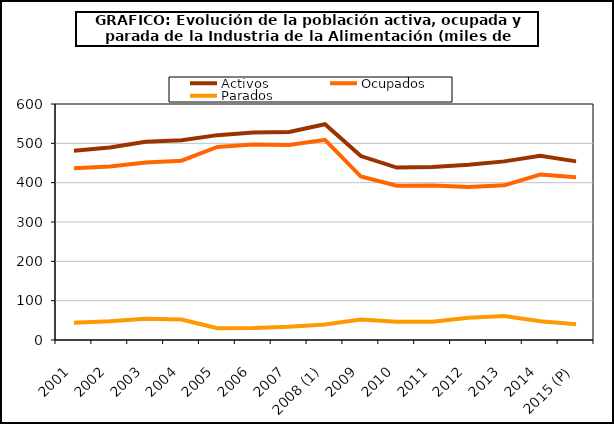
| Category | Activos | Ocupados | Parados |
|---|---|---|---|
| 2001 | 480.9 | 436.8 | 43.725 |
| 2002 | 489.575 | 441 | 47.8 |
| 2003 | 504 | 451.5 | 54 |
| 2004 | 508.05 | 455.9 | 52.175 |
| 2005 | 520.85 | 490.7 | 30.15 |
| 2006 | 527.375 | 496.9 | 30.475 |
| 2007 | 529 | 495.6 | 33.4 |
| 2008 (1) | 548.65 | 509 | 39.7 |
| 2009 | 467.6 | 415.6 | 52 |
| 2010 | 438.425 | 392.275 | 46.2 |
| 2011 | 439.6 | 393.1 | 46.5 |
| 2012 | 445.725 | 388.925 | 56.8 |
| 2013 | 454.1 | 393.3 | 60.8 |
| 2014 | 468.5 | 420.7 | 47.8 |
| 2015 (P) | 454.1 | 414 | 40.1 |